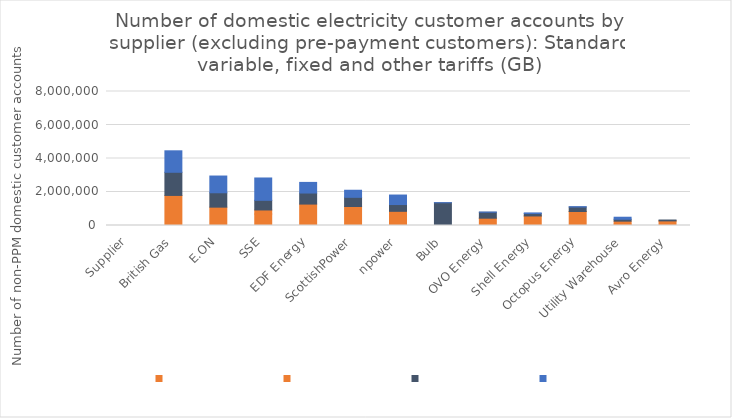
| Category | Series 3 | Series 1 | Series 0 | Series 4 |
|---|---|---|---|---|
| Supplier | 0 | 0 | 0 | 0 |
| British Gas | 1794851 | 0 | 1382639 | 1281907 |
| E.ON | 1095370 | 0 | 858873 | 999233 |
| SSE | 685240 | 241732 | 575689 | 1334347 |
| EDF Energy | 1278641 | 0 | 659519 | 634851 |
| ScottishPower | 1134648 | 0 | 547216 | 422814 |
| npower | 832201 | 14071 | 405153 | 567541 |
| Bulb | 0 | 0 | 1358032 | 1845 |
| OVO Energy | 436001 | 981 | 354279 | 10152 |
| Shell Energy | 569214 | 505 | 143484 | 38027 |
| Octopus Energy | 831213 | 3857 | 267270 | 20834 |
| Utility Warehouse | 81805 | 177241 | 112429 | 122380 |
| Avro Energy | 272559 | 2293 | 52854 | 0 |